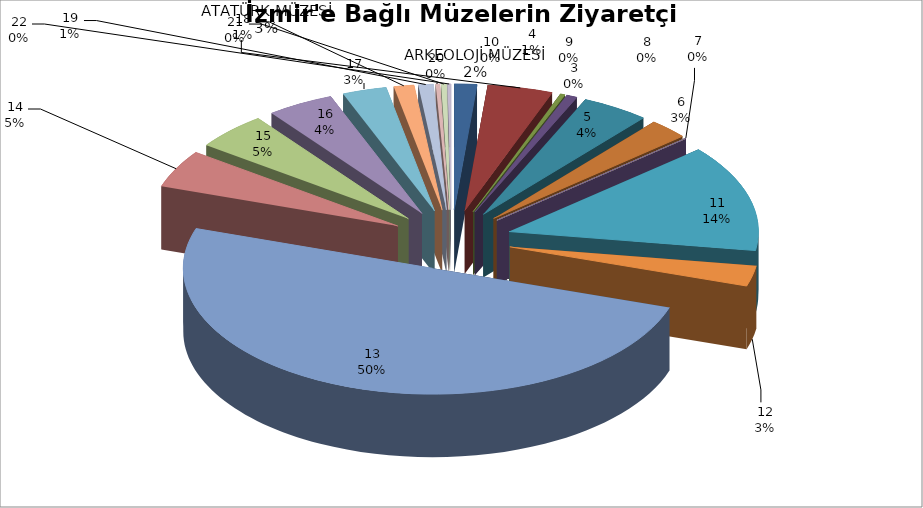
| Category | Series 0 |
|---|---|
| 0 | 58332 |
| 1 | 168603 |
| 2 | 12596 |
| 3 | 27888 |
| 4 | 174686 |
| 5 | 102812 |
| 6 | 1220 |
| 7 | 0 |
| 8 | 0 |
| 9 | 0 |
| 10 | 546137 |
| 11 | 104948 |
| 12 | 1995282 |
| 13 | 192838 |
| 14 | 188737 |
| 15 | 172731 |
| 16 | 113956 |
| 17 | 51971 |
| 18 | 38595 |
| 19 | 10748 |
| 20 | 13807 |
| 21 | 8790 |